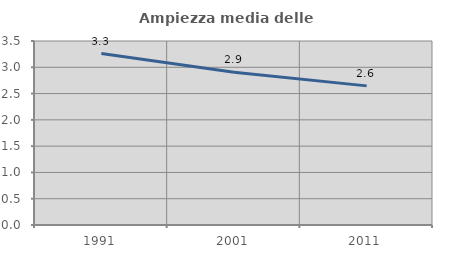
| Category | Ampiezza media delle famiglie |
|---|---|
| 1991.0 | 3.262 |
| 2001.0 | 2.907 |
| 2011.0 | 2.646 |